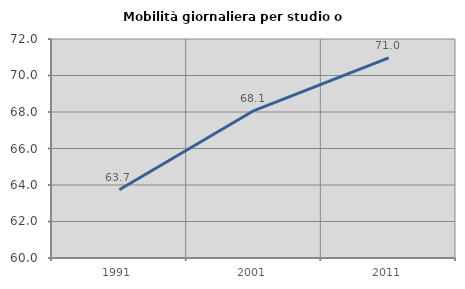
| Category | Mobilità giornaliera per studio o lavoro |
|---|---|
| 1991.0 | 63.743 |
| 2001.0 | 68.081 |
| 2011.0 | 70.963 |